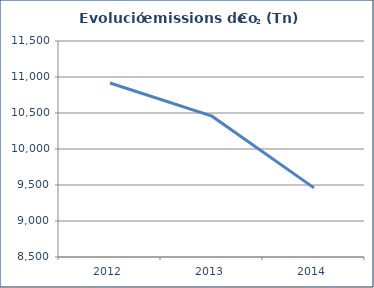
| Category | Co2 (Tn) |
|---|---|
| 2012.0 | 10916.154 |
| 2013.0 | 10456.132 |
| 2014.0 | 9460 |